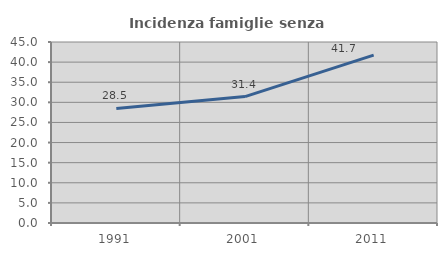
| Category | Incidenza famiglie senza nuclei |
|---|---|
| 1991.0 | 28.475 |
| 2001.0 | 31.434 |
| 2011.0 | 41.719 |